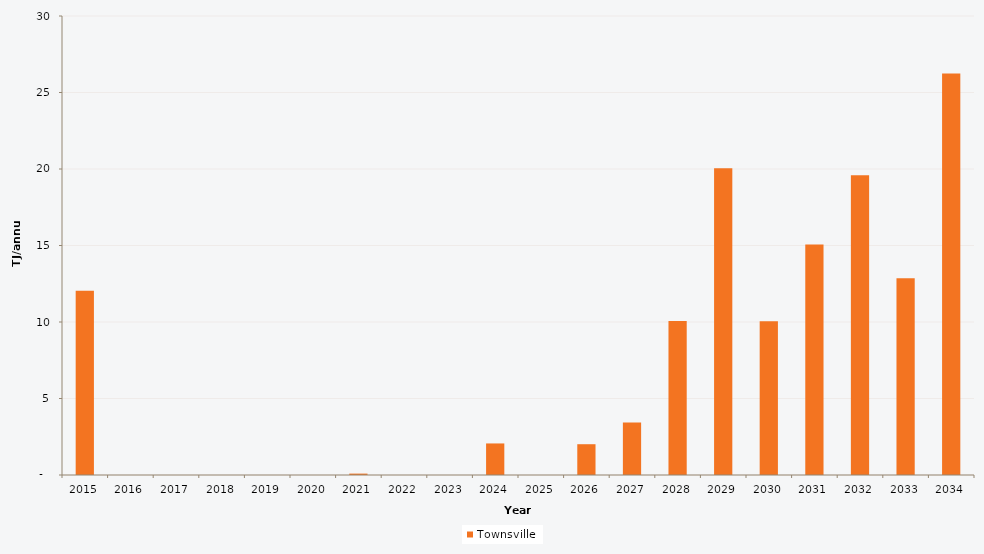
| Category | Townsville |
|---|---|
| 2015.0 | 12.046 |
| 2016.0 | 0 |
| 2017.0 | 0 |
| 2018.0 | 0 |
| 2019.0 | 0 |
| 2020.0 | 0 |
| 2021.0 | 0.091 |
| 2022.0 | 0 |
| 2023.0 | 0 |
| 2024.0 | 2.062 |
| 2025.0 | 0 |
| 2026.0 | 2.012 |
| 2027.0 | 3.439 |
| 2028.0 | 10.072 |
| 2029.0 | 20.055 |
| 2030.0 | 10.049 |
| 2031.0 | 15.073 |
| 2032.0 | 19.592 |
| 2033.0 | 12.865 |
| 2034.0 | 26.245 |